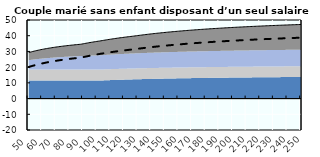
| Category | Coin fiscal moyen (somme des composantes) | Taux moyen d'imposition net en % du salaire brut |
|---|---|---|
| 50.0 | 29.274 | 20.08 |
| 51.0 | 29.514 | 20.351 |
| 52.0 | 29.745 | 20.611 |
| 53.0 | 29.966 | 20.862 |
| 54.0 | 30.18 | 21.104 |
| 55.0 | 30.386 | 21.336 |
| 56.0 | 30.585 | 21.561 |
| 57.0 | 30.776 | 21.777 |
| 58.0 | 30.961 | 21.986 |
| 59.0 | 31.14 | 22.188 |
| 60.0 | 31.313 | 22.383 |
| 61.0 | 31.48 | 22.572 |
| 62.0 | 31.641 | 22.755 |
| 63.0 | 31.798 | 22.932 |
| 64.0 | 31.95 | 23.103 |
| 65.0 | 32.097 | 23.269 |
| 66.0 | 32.239 | 23.43 |
| 67.0 | 32.377 | 23.586 |
| 68.0 | 32.512 | 23.738 |
| 69.0 | 32.642 | 23.885 |
| 70.0 | 32.769 | 24.028 |
| 71.0 | 32.892 | 24.167 |
| 72.0 | 33.011 | 24.303 |
| 73.0 | 33.128 | 24.434 |
| 74.0 | 33.241 | 24.562 |
| 75.0 | 33.351 | 24.687 |
| 76.0 | 33.458 | 24.808 |
| 77.0 | 33.563 | 24.926 |
| 78.0 | 33.665 | 25.041 |
| 79.0 | 33.764 | 25.153 |
| 80.0 | 33.861 | 25.262 |
| 81.0 | 33.955 | 25.369 |
| 82.0 | 34.047 | 25.473 |
| 83.0 | 34.137 | 25.575 |
| 84.0 | 34.225 | 25.674 |
| 85.0 | 34.31 | 25.77 |
| 86.0 | 34.394 | 25.865 |
| 87.0 | 34.476 | 25.957 |
| 88.0 | 34.555 | 26.048 |
| 89.0 | 34.694 | 26.205 |
| 90.0 | 34.863 | 26.396 |
| 91.0 | 35.029 | 26.583 |
| 92.0 | 35.191 | 26.765 |
| 93.0 | 35.349 | 26.944 |
| 94.0 | 35.504 | 27.119 |
| 95.0 | 35.655 | 27.291 |
| 96.0 | 35.804 | 27.458 |
| 97.0 | 35.949 | 27.623 |
| 98.0 | 36.092 | 27.784 |
| 99.0 | 36.231 | 27.942 |
| 100.0 | 36.368 | 28.096 |
| 101.0 | 36.502 | 28.248 |
| 102.0 | 36.634 | 28.396 |
| 103.0 | 36.763 | 28.542 |
| 104.0 | 36.914 | 28.685 |
| 105.0 | 37.064 | 28.825 |
| 106.0 | 37.212 | 28.962 |
| 107.0 | 37.356 | 29.097 |
| 108.0 | 37.498 | 29.23 |
| 109.0 | 37.637 | 29.36 |
| 110.0 | 37.773 | 29.487 |
| 111.0 | 37.907 | 29.613 |
| 112.0 | 38.038 | 29.736 |
| 113.0 | 38.167 | 29.857 |
| 114.0 | 38.293 | 29.976 |
| 115.0 | 38.417 | 30.092 |
| 116.0 | 38.539 | 30.207 |
| 117.0 | 38.659 | 30.32 |
| 118.0 | 38.777 | 30.431 |
| 119.0 | 38.893 | 30.54 |
| 120.0 | 39.006 | 30.647 |
| 121.0 | 39.118 | 30.752 |
| 122.0 | 39.228 | 30.856 |
| 123.0 | 39.336 | 30.958 |
| 124.0 | 39.442 | 31.058 |
| 125.0 | 39.546 | 31.157 |
| 126.0 | 39.649 | 31.254 |
| 127.0 | 39.75 | 31.35 |
| 128.0 | 39.862 | 31.459 |
| 129.0 | 39.98 | 31.575 |
| 130.0 | 40.097 | 31.689 |
| 131.0 | 40.211 | 31.801 |
| 132.0 | 40.323 | 31.912 |
| 133.0 | 40.434 | 32.02 |
| 134.0 | 40.543 | 32.128 |
| 135.0 | 40.651 | 32.233 |
| 136.0 | 40.757 | 32.338 |
| 137.0 | 40.861 | 32.44 |
| 138.0 | 40.963 | 32.541 |
| 139.0 | 41.065 | 32.641 |
| 140.0 | 41.164 | 32.739 |
| 141.0 | 41.262 | 32.836 |
| 142.0 | 41.359 | 32.932 |
| 143.0 | 41.454 | 33.026 |
| 144.0 | 41.548 | 33.119 |
| 145.0 | 41.641 | 33.21 |
| 146.0 | 41.732 | 33.301 |
| 147.0 | 41.822 | 33.39 |
| 148.0 | 41.911 | 33.478 |
| 149.0 | 41.999 | 33.565 |
| 150.0 | 42.085 | 33.65 |
| 151.0 | 42.17 | 33.735 |
| 152.0 | 42.254 | 33.818 |
| 153.0 | 42.337 | 33.9 |
| 154.0 | 42.419 | 33.981 |
| 155.0 | 42.5 | 34.061 |
| 156.0 | 42.579 | 34.141 |
| 157.0 | 42.658 | 34.219 |
| 158.0 | 42.736 | 34.296 |
| 159.0 | 42.812 | 34.372 |
| 160.0 | 42.888 | 34.447 |
| 161.0 | 42.962 | 34.521 |
| 162.0 | 43.036 | 34.595 |
| 163.0 | 43.109 | 34.667 |
| 164.0 | 43.181 | 34.739 |
| 165.0 | 43.252 | 34.809 |
| 166.0 | 43.322 | 34.879 |
| 167.0 | 43.391 | 34.948 |
| 168.0 | 43.459 | 35.016 |
| 169.0 | 43.527 | 35.084 |
| 170.0 | 43.593 | 35.15 |
| 171.0 | 43.659 | 35.216 |
| 172.0 | 43.724 | 35.281 |
| 173.0 | 43.789 | 35.345 |
| 174.0 | 43.852 | 35.409 |
| 175.0 | 43.915 | 35.472 |
| 176.0 | 43.977 | 35.534 |
| 177.0 | 44.039 | 35.595 |
| 178.0 | 44.099 | 35.656 |
| 179.0 | 44.159 | 35.716 |
| 180.0 | 44.219 | 35.775 |
| 181.0 | 44.277 | 35.834 |
| 182.0 | 44.335 | 35.892 |
| 183.0 | 44.393 | 35.949 |
| 184.0 | 44.449 | 36.006 |
| 185.0 | 44.505 | 36.062 |
| 186.0 | 44.561 | 36.118 |
| 187.0 | 44.616 | 36.173 |
| 188.0 | 44.67 | 36.227 |
| 189.0 | 44.724 | 36.281 |
| 190.0 | 44.777 | 36.334 |
| 191.0 | 44.829 | 36.387 |
| 192.0 | 44.881 | 36.439 |
| 193.0 | 44.933 | 36.491 |
| 194.0 | 44.983 | 36.542 |
| 195.0 | 45.034 | 36.592 |
| 196.0 | 45.084 | 36.642 |
| 197.0 | 45.133 | 36.692 |
| 198.0 | 45.182 | 36.741 |
| 199.0 | 45.23 | 36.79 |
| 200.0 | 45.278 | 36.838 |
| 201.0 | 45.325 | 36.885 |
| 202.0 | 45.372 | 36.932 |
| 203.0 | 45.418 | 36.979 |
| 204.0 | 45.464 | 37.025 |
| 205.0 | 45.509 | 37.071 |
| 206.0 | 45.554 | 37.116 |
| 207.0 | 45.599 | 37.161 |
| 208.0 | 45.643 | 37.205 |
| 209.0 | 45.687 | 37.249 |
| 210.0 | 45.73 | 37.293 |
| 211.0 | 45.773 | 37.336 |
| 212.0 | 45.815 | 37.379 |
| 213.0 | 45.857 | 37.421 |
| 214.0 | 45.899 | 37.463 |
| 215.0 | 45.94 | 37.505 |
| 216.0 | 45.981 | 37.546 |
| 217.0 | 46.021 | 37.587 |
| 218.0 | 46.061 | 37.627 |
| 219.0 | 46.101 | 37.667 |
| 220.0 | 46.14 | 37.707 |
| 221.0 | 46.179 | 37.746 |
| 222.0 | 46.218 | 37.785 |
| 223.0 | 46.256 | 37.824 |
| 224.0 | 46.294 | 37.862 |
| 225.0 | 46.331 | 37.9 |
| 226.0 | 46.368 | 37.938 |
| 227.0 | 46.405 | 37.975 |
| 228.0 | 46.442 | 38.012 |
| 229.0 | 46.478 | 38.049 |
| 230.0 | 46.514 | 38.085 |
| 231.0 | 46.55 | 38.121 |
| 232.0 | 46.585 | 38.157 |
| 233.0 | 46.62 | 38.192 |
| 234.0 | 46.654 | 38.227 |
| 235.0 | 46.689 | 38.262 |
| 236.0 | 46.723 | 38.296 |
| 237.0 | 46.757 | 38.33 |
| 238.0 | 46.79 | 38.364 |
| 239.0 | 46.823 | 38.398 |
| 240.0 | 46.856 | 38.431 |
| 241.0 | 46.889 | 38.464 |
| 242.0 | 46.921 | 38.497 |
| 243.0 | 46.953 | 38.53 |
| 244.0 | 46.985 | 38.562 |
| 245.0 | 47.017 | 38.594 |
| 246.0 | 47.048 | 38.626 |
| 247.0 | 47.079 | 38.657 |
| 248.0 | 47.11 | 38.688 |
| 249.0 | 47.14 | 38.719 |
| 250.0 | 47.17 | 38.75 |